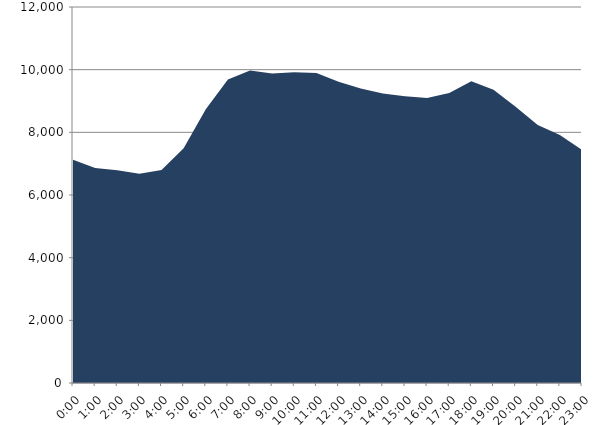
| Category | Series 0 | Series 1 |
|---|---|---|
| 2020-10-21 |  | 7123.158 |
| 2020-10-21 01:00:00 |  | 6864.821 |
| 2020-10-21 02:00:00 |  | 6788.083 |
| 2020-10-21 03:00:00 |  | 6677.476 |
| 2020-10-21 04:00:00 |  | 6795.183 |
| 2020-10-21 05:00:00 |  | 7490.233 |
| 2020-10-21 06:00:00 |  | 8733.734 |
| 2020-10-21 07:00:00 |  | 9686.97 |
| 2020-10-21 08:00:00 |  | 9969.846 |
| 2020-10-21 09:00:00 |  | 9875.732 |
| 2020-10-21 10:00:00 |  | 9921.243 |
| 2020-10-21 11:00:00 |  | 9890.978 |
| 2020-10-21 12:00:00 |  | 9610.703 |
| 2020-10-21 13:00:00 |  | 9395.525 |
| 2020-10-21 14:00:00 |  | 9237.687 |
| 2020-10-21 15:00:00 |  | 9155.472 |
| 2020-10-21 16:00:00 |  | 9097.755 |
| 2020-10-21 17:00:00 |  | 9257.502 |
| 2020-10-21 18:00:00 |  | 9634.062 |
| 2020-10-21 19:00:00 |  | 9361.494 |
| 2020-10-21 20:00:00 |  | 8818.119 |
| 2020-10-21 21:00:00 |  | 8231.257 |
| 2020-10-21 22:00:00 |  | 7914.081 |
| 2020-10-21 23:00:00 |  | 7438.471 |